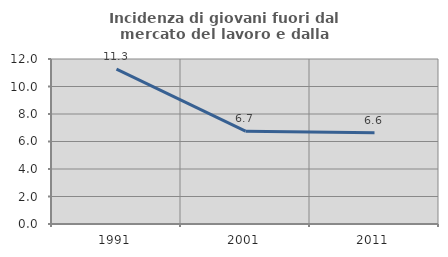
| Category | Incidenza di giovani fuori dal mercato del lavoro e dalla formazione  |
|---|---|
| 1991.0 | 11.257 |
| 2001.0 | 6.749 |
| 2011.0 | 6.63 |